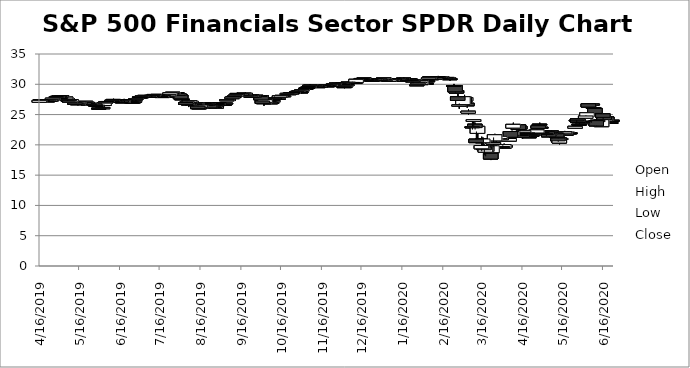
| Category | Open | High | Low | Close |
|---|---|---|---|---|
| 6/23/20 | 24.07 | 24.22 | 23.82 | 23.96 |
| 6/22/20 | 23.68 | 23.88 | 23.53 | 23.71 |
| 6/19/20 | 24.6 | 24.61 | 23.71 | 23.98 |
| 6/18/20 | 23.93 | 24.37 | 23.86 | 24.14 |
| 6/17/20 | 24.61 | 24.61 | 24.13 | 24.17 |
| 6/16/20 | 25.12 | 25.12 | 23.95 | 24.54 |
| 6/15/20 | 23.01 | 24.238 | 22.96 | 24.16 |
| 6/12/20 | 24.06 | 24.06 | 23.22 | 23.83 |
| 6/11/20 | 24 | 24.36 | 23.09 | 23.13 |
| 6/10/20 | 26.02 | 26.16 | 25.17 | 25.19 |
| 6/9/20 | 26.11 | 26.4 | 25.92 | 26.17 |
| 6/8/20 | 26.67 | 26.795 | 26.37 | 26.74 |
| 6/5/20 | 26.78 | 26.825 | 26.15 | 26.24 |
| 6/4/20 | 24.72 | 25.3 | 24.52 | 25.3 |
| 6/3/20 | 24.4 | 24.87 | 24.34 | 24.76 |
| 6/2/20 | 23.89 | 24.04 | 23.7 | 23.87 |
| 6/1/20 | 23.5 | 23.79 | 23.34 | 23.68 |
| 5/29/20 | 23.4 | 23.62 | 23.17 | 23.41 |
| 5/28/20 | 24.33 | 24.34 | 23.61 | 23.68 |
| 5/27/20 | 24.09 | 24.1 | 23.54 | 24.06 |
| 5/26/20 | 22.75 | 23.3 | 22.73 | 23.06 |
| 5/22/20 | 21.99 | 22.02 | 21.7 | 21.92 |
| 5/21/20 | 22 | 22.21 | 21.88 | 22 |
| 5/20/20 | 21.95 | 22.2 | 21.93 | 22.07 |
| 5/19/20 | 22 | 22.11 | 21.58 | 21.59 |
| 5/18/20 | 21.83 | 22.3 | 21.677 | 22.13 |
| 5/15/20 | 20.99 | 21.23 | 20.795 | 21.05 |
| 5/14/20 | 20.3 | 21.21 | 20.085 | 21.19 |
| 5/13/20 | 21.11 | 21.14 | 20.5 | 20.66 |
| 5/12/20 | 21.95 | 22.03 | 21.27 | 21.29 |
| 5/11/20 | 21.98 | 22.05 | 21.74 | 21.86 |
| 5/8/20 | 22.24 | 22.32 | 22.01 | 22.29 |
| 5/7/20 | 21.6 | 22.18 | 21.6 | 21.82 |
| 5/6/20 | 21.99 | 22.05 | 21.3 | 21.32 |
| 5/5/20 | 22.16 | 22.275 | 21.79 | 21.79 |
| 5/4/20 | 21.77 | 21.89 | 21.44 | 21.86 |
| 5/1/20 | 22.25 | 22.31 | 21.912 | 22.06 |
| 4/30/20 | 22.91 | 23.16 | 22.675 | 22.79 |
| 4/29/20 | 23.42 | 23.655 | 23.18 | 23.38 |
| 4/28/20 | 23.16 | 23.325 | 22.67 | 22.72 |
| 4/27/20 | 21.96 | 22.6 | 21.92 | 22.48 |
| 4/24/20 | 21.66 | 21.825 | 21.33 | 21.74 |
| 4/23/20 | 21.58 | 21.86 | 21.4 | 21.43 |
| 4/22/20 | 21.73 | 21.79 | 21.47 | 21.52 |
| 4/21/20 | 21.33 | 21.71 | 21.21 | 21.29 |
| 4/20/20 | 21.95 | 22.36 | 21.75 | 22 |
| 4/17/20 | 22.1 | 22.515 | 21.92 | 22.39 |
| 4/16/20 | 21.6 | 21.64 | 21.06 | 21.27 |
| 4/15/20 | 21.73 | 21.86 | 21.54 | 21.65 |
| 4/14/20 | 23.07 | 23.135 | 22.21 | 22.63 |
| 4/13/20 | 23.31 | 23.33 | 22.325 | 22.53 |
| 4/9/20 | 22.77 | 23.655 | 22.73 | 23.38 |
| 4/8/20 | 21.58 | 22.33 | 21.34 | 22.19 |
| 4/7/20 | 22.2 | 22.22 | 21.25 | 21.26 |
| 4/6/20 | 20.62 | 21.218 | 20.472 | 21.05 |
| 4/3/20 | 19.85 | 20.14 | 19.355 | 19.64 |
| 4/2/20 | 19.43 | 20.2 | 19.365 | 20.04 |
| 4/1/20 | 19.72 | 19.94 | 19.37 | 19.55 |
| 3/31/20 | 21.21 | 21.45 | 20.635 | 20.82 |
| 3/30/20 | 21.04 | 21.525 | 20.6 | 21.41 |
| 3/27/20 | 20.79 | 21.67 | 20.55 | 21.01 |
| 3/26/20 | 20.66 | 21.82 | 20.625 | 21.67 |
| 3/25/20 | 20.14 | 21.23 | 19.387 | 20.39 |
| 3/24/20 | 18.71 | 19.96 | 18.575 | 19.85 |
| 3/23/20 | 18.6 | 18.6 | 17.49 | 17.66 |
| 3/20/20 | 19.82 | 19.92 | 18.67 | 18.91 |
| 3/19/20 | 18.79 | 19.89 | 18.11 | 19.61 |
| 3/18/20 | 19.65 | 20.05 | 18.28 | 19.19 |
| 3/17/20 | 20.35 | 21.19 | 19.54 | 20.97 |
| 3/16/20 | 19.35 | 21.34 | 18.93 | 19.89 |
| 3/13/20 | 21.9 | 23.09 | 20.9 | 23.05 |
| 3/12/20 | 20.94 | 22.21 | 20.3 | 20.37 |
| 3/11/20 | 23.41 | 23.65 | 22.52 | 22.84 |
| 3/10/20 | 23.87 | 24.17 | 22.84 | 24.15 |
| 3/9/20 | 23 | 23.88 | 22.52 | 22.81 |
| 3/6/20 | 25.25 | 25.84 | 25.03 | 25.55 |
| 3/5/20 | 26.87 | 26.94 | 26.15 | 26.45 |
| 3/4/20 | 27.26 | 27.8 | 26.8 | 27.79 |
| 3/3/20 | 27.86 | 28.25 | 26.625 | 26.9 |
| 3/2/20 | 26.64 | 27.95 | 26.36 | 27.95 |
| 2/28/20 | 26.4 | 26.85 | 25.97 | 26.59 |
| 2/27/20 | 27.94 | 28.39 | 27.31 | 27.33 |
| 2/26/20 | 28.95 | 29.22 | 28.55 | 28.55 |
| 2/25/20 | 29.77 | 29.84 | 28.62 | 28.76 |
| 2/24/20 | 29.8 | 30.06 | 29.63 | 29.77 |
| 2/21/20 | 30.92 | 30.99 | 30.6 | 30.77 |
| 2/20/20 | 31.02 | 31.28 | 30.86 | 31.07 |
| 2/19/20 | 31.01 | 31.21 | 30.97 | 31.13 |
| 2/18/20 | 31.08 | 31.16 | 30.72 | 30.9 |
| 2/14/20 | 31.1 | 31.19 | 31.015 | 31.17 |
| 2/13/20 | 31.04 | 31.2 | 30.953 | 31.13 |
| 2/12/20 | 31.28 | 31.38 | 31.1 | 31.14 |
| 2/11/20 | 31.09 | 31.26 | 31.09 | 31.12 |
| 2/10/20 | 30.82 | 31.01 | 30.81 | 31.01 |
| 2/7/20 | 30.86 | 31.01 | 30.79 | 30.92 |
| 2/6/20 | 31.24 | 31.27 | 30.965 | 31.03 |
| 2/5/20 | 30.87 | 31.1 | 30.8 | 31.07 |
| 2/4/20 | 30.58 | 30.75 | 30.45 | 30.46 |
| 2/3/20 | 30.17 | 30.47 | 30.149 | 30.17 |
| 1/31/20 | 30.34 | 30.384 | 29.85 | 29.96 |
| 1/30/20 | 29.95 | 30.62 | 29.93 | 30.6 |
| 1/29/20 | 30.37 | 30.475 | 30.17 | 30.22 |
| 1/28/20 | 30.08 | 30.4 | 30.03 | 30.27 |
| 1/27/20 | 29.84 | 30.06 | 29.75 | 29.92 |
| 1/24/20 | 30.79 | 30.79 | 30.196 | 30.39 |
| 1/23/20 | 30.7 | 30.85 | 30.49 | 30.78 |
| 1/22/20 | 30.87 | 30.94 | 30.815 | 30.86 |
| 1/21/20 | 30.88 | 31.02 | 30.77 | 30.77 |
| 1/17/20 | 31.03 | 31.1 | 30.911 | 31.03 |
| 1/16/20 | 30.82 | 30.94 | 30.754 | 30.94 |
| 1/15/20 | 30.69 | 30.79 | 30.57 | 30.67 |
| 1/14/20 | 30.9 | 31.08 | 30.8 | 30.84 |
| 1/13/20 | 30.76 | 30.93 | 30.68 | 30.9 |
| 1/10/20 | 30.94 | 30.95 | 30.65 | 30.69 |
| 1/9/20 | 30.95 | 30.975 | 30.83 | 30.92 |
| 1/8/20 | 30.56 | 30.9 | 30.56 | 30.73 |
| 1/7/20 | 30.66 | 30.71 | 30.53 | 30.53 |
| 1/6/20 | 30.47 | 30.75 | 30.46 | 30.73 |
| 1/3/20 | 30.68 | 30.88 | 30.59 | 30.75 |
| 1/2/20 | 30.89 | 31.08 | 30.8 | 31.08 |
| 12/31/19 | 30.66 | 30.79 | 30.62 | 30.78 |
| 12/30/19 | 30.91 | 30.96 | 30.65 | 30.68 |
| 12/27/19 | 30.9 | 30.91 | 30.75 | 30.77 |
| 12/26/19 | 30.71 | 30.85 | 30.71 | 30.85 |
| 12/24/19 | 30.67 | 30.69 | 30.6 | 30.68 |
| 12/23/19 | 30.76 | 30.77 | 30.57 | 30.61 |
| 12/20/19 | 30.8 | 30.88 | 30.64 | 30.68 |
| 12/19/19 | 30.82 | 30.89 | 30.77 | 30.8 |
| 12/18/19 | 31.04 | 31.04 | 30.81 | 30.81 |
| 12/17/19 | 30.84 | 31.04 | 30.83 | 30.94 |
| 12/16/19 | 30.96 | 31.02 | 30.79 | 30.82 |
| 12/13/19 | 30.79 | 30.97 | 30.53 | 30.71 |
| 12/12/19 | 30.27 | 30.91 | 30.25 | 30.82 |
| 12/11/19 | 30.29 | 30.34 | 30.2 | 30.23 |
| 12/10/19 | 30.21 | 30.36 | 30.13 | 30.3 |
| 12/9/19 | 30.3 | 30.42 | 30.28 | 30.29 |
| 12/6/19 | 30.29 | 30.46 | 30.28 | 30.36 |
| 12/5/19 | 29.94 | 30.01 | 29.83 | 29.96 |
| 12/4/19 | 29.57 | 29.9 | 29.55 | 29.82 |
| 12/3/19 | 29.61 | 29.62 | 29.35 | 29.54 |
| 12/2/19 | 30.2 | 30.26 | 29.93 | 29.96 |
| 11/29/19 | 30.14 | 30.236 | 30.09 | 30.15 |
| 11/27/19 | 30.16 | 30.21 | 30.06 | 30.2 |
| 11/26/19 | 30.11 | 30.11 | 29.932 | 30.08 |
| 11/25/19 | 29.96 | 30.15 | 29.95 | 30.11 |
| 11/22/19 | 29.74 | 29.948 | 29.74 | 29.92 |
| 11/21/19 | 29.79 | 29.84 | 29.595 | 29.7 |
| 11/20/19 | 29.75 | 29.81 | 29.52 | 29.73 |
| 11/19/19 | 29.88 | 29.97 | 29.794 | 29.87 |
| 11/18/19 | 29.75 | 29.82 | 29.66 | 29.81 |
| 11/15/19 | 29.77 | 29.8 | 29.66 | 29.75 |
| 11/14/19 | 29.53 | 29.67 | 29.47 | 29.67 |
| 11/13/19 | 29.57 | 29.71 | 29.45 | 29.61 |
| 11/12/19 | 29.77 | 29.89 | 29.69 | 29.8 |
| 11/11/19 | 29.66 | 29.82 | 29.622 | 29.76 |
| 11/8/19 | 29.82 | 29.85 | 29.64 | 29.84 |
| 11/7/19 | 29.81 | 30.03 | 29.74 | 29.85 |
| 11/6/19 | 29.46 | 29.63 | 29.42 | 29.63 |
| 11/5/19 | 29.46 | 29.62 | 29.41 | 29.48 |
| 11/4/19 | 29.37 | 29.42 | 29.29 | 29.37 |
| 11/1/19 | 28.92 | 29.15 | 28.86 | 29.12 |
| 10/31/19 | 28.74 | 28.75 | 28.47 | 28.7 |
| 10/30/19 | 28.86 | 28.916 | 28.64 | 28.84 |
| 10/29/19 | 28.73 | 29 | 28.7 | 28.86 |
| 10/28/19 | 28.75 | 28.92 | 28.74 | 28.79 |
| 10/25/19 | 28.47 | 28.73 | 28.228 | 28.64 |
| 10/24/19 | 28.57 | 28.62 | 28.39 | 28.5 |
| 10/23/19 | 28.36 | 28.54 | 28.35 | 28.54 |
| 10/22/19 | 28.45 | 28.61 | 28.33 | 28.42 |
| 10/21/19 | 28.35 | 28.54 | 28.34 | 28.5 |
| 10/18/19 | 27.96 | 28.22 | 27.957 | 28.11 |
| 10/17/19 | 28.17 | 28.25 | 27.97 | 28.04 |
| 10/16/19 | 28.09 | 28.16 | 27.95 | 28.02 |
| 10/15/19 | 27.85 | 28.256 | 27.74 | 28.09 |
| 10/14/19 | 27.56 | 27.75 | 27.53 | 27.69 |
| 10/11/19 | 27.74 | 27.99 | 27.64 | 27.65 |
| 10/10/19 | 27.1 | 27.51 | 27.1 | 27.31 |
| 10/9/19 | 26.95 | 27.16 | 26.92 | 27.03 |
| 10/8/19 | 27.05 | 27.06 | 26.76 | 26.78 |
| 10/7/19 | 27.35 | 27.57 | 27.29 | 27.32 |
| 10/4/19 | 26.99 | 27.48 | 26.97 | 27.46 |
| 10/3/19 | 26.81 | 26.96 | 26.45 | 26.96 |
| 10/2/19 | 27.24 | 27.25 | 26.79 | 26.85 |
| 10/1/19 | 28.13 | 28.15 | 27.41 | 27.41 |
| 9/30/19 | 28.14 | 28.17 | 27.984 | 28 |
| 9/27/19 | 28.19 | 28.29 | 27.92 | 28.07 |
| 9/26/19 | 28.05 | 28.084 | 27.92 | 27.96 |
| 9/25/19 | 27.92 | 28.14 | 27.81 | 28.09 |
| 9/24/19 | 28.21 | 28.27 | 27.78 | 27.86 |
| 9/23/19 | 27.94 | 28.21 | 27.89 | 28.13 |
| 9/20/19 | 28.29 | 28.4 | 28.06 | 28.08 |
| 9/19/19 | 28.5 | 28.67 | 28.375 | 28.39 |
| 9/18/19 | 28.31 | 28.59 | 28.23 | 28.52 |
| 9/17/19 | 28.29 | 28.42 | 28.19 | 28.42 |
| 9/16/19 | 28.25 | 28.43 | 28.21 | 28.39 |
| 9/13/19 | 28.49 | 28.6 | 28.36 | 28.49 |
| 9/12/19 | 28.04 | 28.38 | 27.95 | 28.27 |
| 9/11/19 | 27.98 | 28.15 | 27.73 | 28.12 |
| 9/10/19 | 27.95 | 28.075 | 27.7 | 27.96 |
| 9/9/19 | 27.63 | 27.97 | 27.57 | 27.86 |
| 9/6/19 | 27.48 | 27.56 | 27.335 | 27.44 |
| 9/5/19 | 27.28 | 27.68 | 27.27 | 27.45 |
| 9/4/19 | 26.84 | 26.95 | 26.78 | 26.9 |
| 9/3/19 | 26.7 | 26.73 | 26.405 | 26.64 |
| 8/30/19 | 26.98 | 27.055 | 26.82 | 26.92 |
| 8/29/19 | 26.67 | 26.915 | 26.62 | 26.83 |
| 8/28/19 | 26.05 | 26.465 | 26.03 | 26.43 |
| 8/27/19 | 26.45 | 26.53 | 26.03 | 26.19 |
| 8/26/19 | 26.27 | 26.37 | 26.11 | 26.35 |
| 8/23/19 | 26.59 | 26.79 | 25.92 | 26.1 |
| 8/22/19 | 26.74 | 26.85 | 26.57 | 26.78 |
| 8/21/19 | 26.65 | 26.69 | 26.53 | 26.6 |
| 8/20/19 | 26.69 | 26.74 | 26.45 | 26.48 |
| 8/19/19 | 26.98 | 27.03 | 26.785 | 26.84 |
| 8/16/19 | 26.24 | 26.64 | 26.24 | 26.57 |
| 8/15/19 | 26.11 | 26.275 | 25.915 | 26.11 |
| 8/14/19 | 26.38 | 26.52 | 25.96 | 25.98 |
| 8/13/19 | 26.6 | 27.17 | 26.5 | 26.98 |
| 8/12/19 | 26.85 | 26.95 | 26.57 | 26.65 |
| 8/9/19 | 27.11 | 27.31 | 26.9 | 27.17 |
| 8/8/19 | 27.01 | 27.27 | 26.79 | 27.26 |
| 8/7/19 | 26.6 | 26.87 | 26.24 | 26.75 |
| 8/6/19 | 26.85 | 27.13 | 26.59 | 27.11 |
| 8/5/19 | 26.99 | 27.12 | 26.475 | 26.68 |
| 8/2/19 | 27.56 | 27.735 | 27.23 | 27.6 |
| 8/1/19 | 28.23 | 28.42 | 27.57 | 27.61 |
| 7/31/19 | 28.39 | 28.527 | 28.195 | 28.25 |
| 7/30/19 | 28.25 | 28.42 | 28.19 | 28.39 |
| 7/29/19 | 28.64 | 28.72 | 28.44 | 28.47 |
| 7/26/19 | 28.44 | 28.71 | 28.38 | 28.69 |
| 7/25/19 | 28.57 | 28.61 | 28.315 | 28.38 |
| 7/24/19 | 28.23 | 28.58 | 28.21 | 28.58 |
| 7/23/19 | 28.07 | 28.33 | 28.06 | 28.29 |
| 7/22/19 | 27.88 | 28.045 | 27.83 | 28 |
| 7/19/19 | 28.13 | 28.18 | 27.92 | 27.94 |
| 7/18/19 | 27.81 | 28.11 | 27.78 | 28.06 |
| 7/17/19 | 27.99 | 28.075 | 27.81 | 27.85 |
| 7/16/19 | 28.21 | 28.255 | 28.025 | 28.09 |
| 7/15/19 | 28.33 | 28.35 | 28.08 | 28.16 |
| 7/12/19 | 28.17 | 28.32 | 28.099 | 28.32 |
| 7/11/19 | 28.01 | 28.17 | 27.96 | 28.13 |
| 7/10/19 | 28.08 | 28.23 | 27.93 | 27.97 |
| 7/9/19 | 27.83 | 28.12 | 27.81 | 28.07 |
| 7/8/19 | 28.01 | 28.13 | 27.94 | 28.02 |
| 7/5/19 | 28.17 | 28.265 | 28.03 | 28.16 |
| 7/3/19 | 27.95 | 28.09 | 27.87 | 28.08 |
| 7/2/19 | 27.93 | 27.975 | 27.71 | 27.86 |
| 7/1/19 | 27.92 | 28.05 | 27.78 | 27.93 |
| 6/28/19 | 27.53 | 27.7 | 27.236 | 27.6 |
| 6/27/19 | 27.07 | 27.29 | 27.07 | 27.21 |
| 6/26/19 | 27.08 | 27.21 | 26.96 | 26.97 |
| 6/25/19 | 27.11 | 27.15 | 26.89 | 27.02 |
| 6/24/19 | 27.17 | 27.355 | 27.08 | 27.11 |
| 6/21/19 | 27.3 | 27.48 | 27.18 | 27.22 |
| 6/20/19 | 27.45 | 27.53 | 27.12 | 27.42 |
| 6/19/19 | 27.4 | 27.59 | 27.27 | 27.3 |
| 6/18/19 | 26.93 | 27.46 | 26.93 | 27.35 |
| 6/17/19 | 27.23 | 27.305 | 26.96 | 26.99 |
| 6/14/19 | 27.21 | 27.33 | 27 | 27.24 |
| 6/13/19 | 27.14 | 27.27 | 27.07 | 27.18 |
| 6/12/19 | 27.33 | 27.38 | 27.03 | 27.09 |
| 6/11/19 | 27.5 | 27.61 | 27.275 | 27.36 |
| 6/10/19 | 27.28 | 27.55 | 27.28 | 27.35 |
| 6/7/19 | 27.16 | 27.25 | 27.08 | 27.12 |
| 6/6/19 | 27.07 | 27.268 | 26.923 | 27.16 |
| 6/5/19 | 26.94 | 27.08 | 26.71 | 27.06 |
| 6/4/19 | 26.5 | 26.92 | 26.43 | 26.89 |
| 6/3/19 | 25.97 | 26.29 | 25.92 | 26.18 |
| 5/31/19 | 26.07 | 26.2 | 25.99 | 26.01 |
| 5/30/19 | 26.56 | 26.71 | 26.28 | 26.41 |
| 5/29/19 | 26.34 | 26.545 | 26.215 | 26.5 |
| 5/28/19 | 26.78 | 26.86 | 26.535 | 26.55 |
| 5/24/19 | 26.75 | 26.87 | 26.67 | 26.86 |
| 5/23/19 | 26.77 | 26.78 | 26.42 | 26.65 |
| 5/22/19 | 27.05 | 27.11 | 26.954 | 27.03 |
| 5/21/19 | 27.02 | 27.19 | 27.02 | 27.19 |
| 5/20/19 | 26.78 | 27.03 | 26.78 | 26.91 |
| 5/17/19 | 26.79 | 27.14 | 26.75 | 26.88 |
| 5/16/19 | 26.88 | 27.21 | 26.86 | 27.06 |
| 5/15/19 | 26.62 | 26.92 | 26.52 | 26.79 |
| 5/14/19 | 26.74 | 27.12 | 26.71 | 26.89 |
| 5/13/19 | 26.93 | 26.99 | 26.59 | 26.68 |
| 5/10/19 | 27.15 | 27.525 | 26.91 | 27.48 |
| 5/9/19 | 27.03 | 27.355 | 26.895 | 27.3 |
| 5/8/19 | 27.31 | 27.59 | 27.235 | 27.36 |
| 5/7/19 | 27.62 | 27.885 | 27.23 | 27.42 |
| 5/6/19 | 27.58 | 27.98 | 27.53 | 27.88 |
| 5/3/19 | 27.94 | 28.12 | 27.885 | 28.07 |
| 5/2/19 | 27.77 | 27.95 | 27.62 | 27.82 |
| 5/1/19 | 28.05 | 28.14 | 27.77 | 27.79 |
| 4/30/19 | 28.02 | 28.06 | 27.783 | 28.02 |
| 4/29/19 | 27.8 | 28.128 | 27.73 | 27.98 |
| 4/26/19 | 27.45 | 27.72 | 27.41 | 27.7 |
| 4/25/19 | 27.27 | 27.56 | 27.2 | 27.45 |
| 4/24/19 | 27.34 | 27.523 | 27.28 | 27.4 |
| 4/23/19 | 27.25 | 27.46 | 27.14 | 27.43 |
| 4/22/19 | 27.26 | 27.336 | 27.17 | 27.26 |
| 4/18/19 | 27.37 | 27.45 | 27.3 | 27.34 |
| 4/17/19 | 27.45 | 27.46 | 27.2 | 27.42 |
| 4/16/19 | 27.03 | 27.38 | 27.01 | 27.35 |